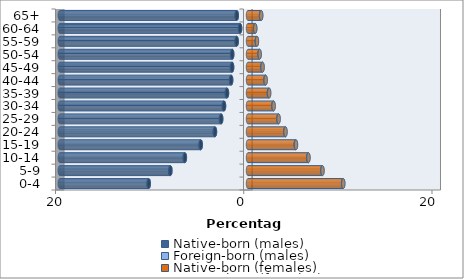
| Category | Native-born (males) | Foreign-born (males) | Native-born (females) | Foreign-born (females) |
|---|---|---|---|---|
| 0-4 | -10.546 | -0.023 | 10.102 | 0.026 |
| 5-9 | -8.245 | -0.026 | 7.889 | 0.031 |
| 10-14 | -6.707 | -0.024 | 6.397 | 0.03 |
| 15-19 | -5.02 | -0.031 | 5.068 | 0.035 |
| 20-24 | -3.509 | -0.035 | 3.955 | 0.036 |
| 25-29 | -2.848 | -0.038 | 3.217 | 0.04 |
| 30-34 | -2.548 | -0.034 | 2.689 | 0.039 |
| 35-39 | -2.232 | -0.031 | 2.219 | 0.037 |
| 40-44 | -1.789 | -0.028 | 1.852 | 0.029 |
| 45-49 | -1.688 | -0.024 | 1.53 | 0.022 |
| 50-54 | -1.676 | -0.018 | 1.221 | 0.018 |
| 55-59 | -1.202 | -0.012 | 0.937 | 0.015 |
| 60-64 | -0.839 | -0.011 | 0.757 | 0.014 |
| 65+ | -1.193 | -0.016 | 1.385 | 0.02 |